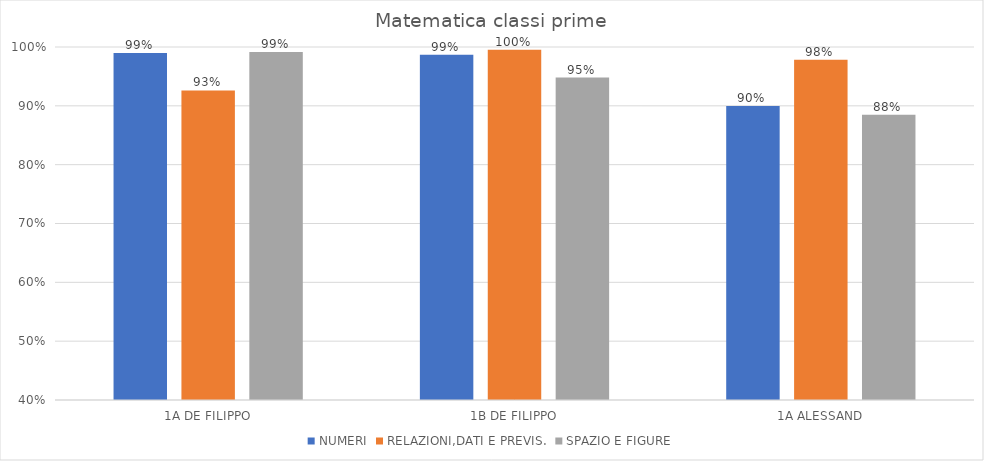
| Category | NUMERI | RELAZIONI,DATI E PREVIS. | SPAZIO E FIGURE |
|---|---|---|---|
| 1A DE FILIPPO | 0.99 | 0.926 | 0.991 |
| 1B DE FILIPPO | 0.987 | 0.995 | 0.948 |
| 1A ALESSAND | 0.9 | 0.978 | 0.885 |